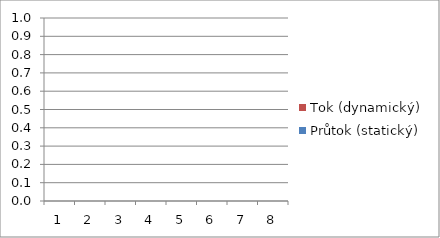
| Category | Tok (dynamický) | Průtok (statický) |
|---|---|---|
| 1.0 | 0 | 0 |
| 2.0 | 0 | 0 |
| 3.0 | 0 | 0 |
| 4.0 | 0 | 0 |
| 5.0 | 0 | 0 |
| 6.0 | 0 | 0 |
| 7.0 | 0 | 0 |
| 8.0 | 0 | 0 |